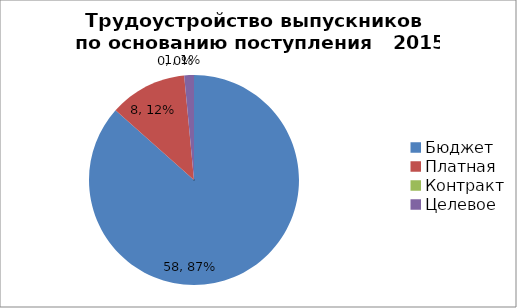
| Category | 2016 г. |
|---|---|
| Бюджет | 58 |
| Платная | 8 |
| Контракт | 0 |
| Целевое | 1 |